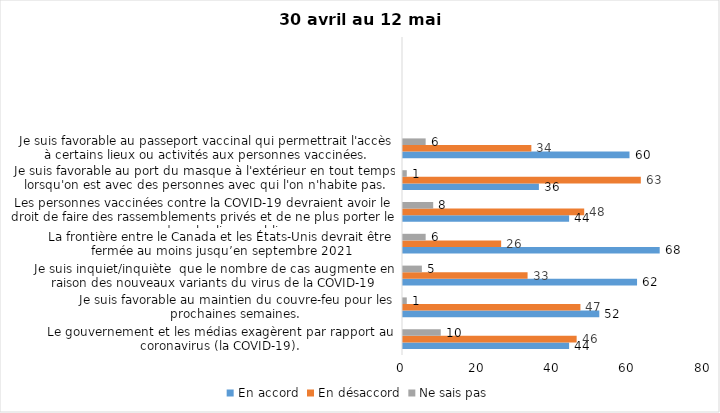
| Category | En accord | En désaccord | Ne sais pas |
|---|---|---|---|
| Le gouvernement et les médias exagèrent par rapport au coronavirus (la COVID-19). | 44 | 46 | 10 |
| Je suis favorable au maintien du couvre-feu pour les prochaines semaines. | 52 | 47 | 1 |
| Je suis inquiet/inquiète  que le nombre de cas augmente en raison des nouveaux variants du virus de la COVID-19 | 62 | 33 | 5 |
| La frontière entre le Canada et les États-Unis devrait être fermée au moins jusqu’en septembre 2021 | 68 | 26 | 6 |
| Les personnes vaccinées contre la COVID-19 devraient avoir le droit de faire des rassemblements privés et de ne plus porter le masque dans les lieux publics. | 44 | 48 | 8 |
| Je suis favorable au port du masque à l'extérieur en tout temps lorsqu'on est avec des personnes avec qui l'on n'habite pas. | 36 | 63 | 1 |
| Je suis favorable au passeport vaccinal qui permettrait l'accès à certains lieux ou activités aux personnes vaccinées. | 60 | 34 | 6 |